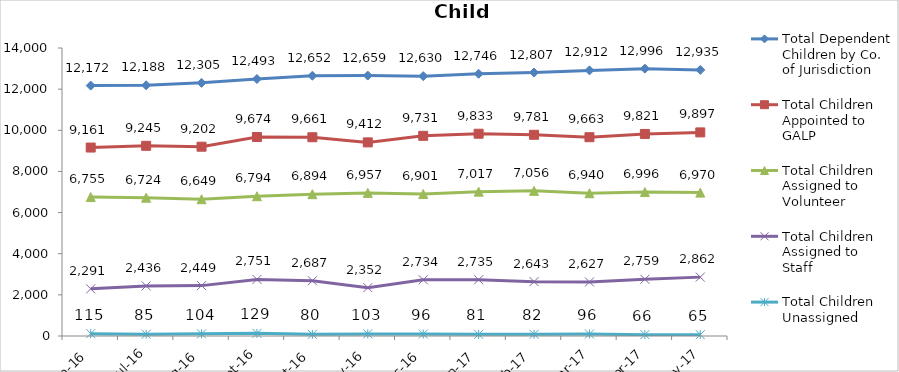
| Category | Total Dependent Children by Co. of Jurisdiction | Total Children Appointed to GALP | Total Children Assigned to Volunteer | Total Children Assigned to Staff | Total Children Unassigned |
|---|---|---|---|---|---|
| Jun-16 | 12172 | 9161 | 6755 | 2291 | 115 |
| Jul-16 | 12188 | 9245 | 6724 | 2436 | 85 |
| Aug-16 | 12305 | 9202 | 6649 | 2449 | 104 |
| Sep-16 | 12493 | 9674 | 6794 | 2751 | 129 |
| Oct-16 | 12652 | 9661 | 6894 | 2687 | 80 |
| Nov-16 | 12659 | 9412 | 6957 | 2352 | 103 |
| Dec-16 | 12630 | 9731 | 6901 | 2734 | 96 |
| Jan-17 | 12746 | 9833 | 7017 | 2735 | 81 |
| Feb-17 | 12807 | 9781 | 7056 | 2643 | 82 |
| Mar-17 | 12912 | 9663 | 6940 | 2627 | 96 |
| Apr-17 | 12996 | 9821 | 6996 | 2759 | 66 |
| May-17 | 12935 | 9897 | 6970 | 2862 | 65 |